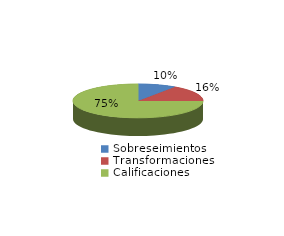
| Category | Series 0 |
|---|---|
| Sobreseimientos | 320 |
| Transformaciones | 524 |
| Calificaciones | 2506 |